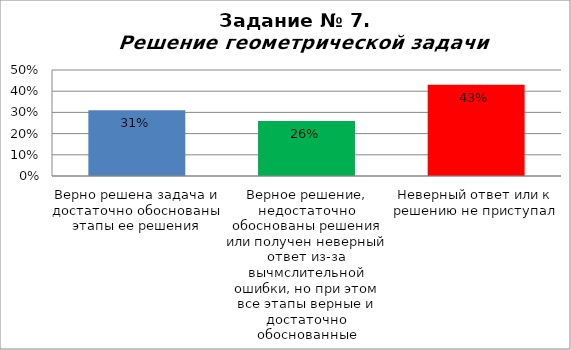
| Category | Решение геометрической задачи  |
|---|---|
| Верно решена задача и достаточно обоснованы этапы ее решения | 0.31 |
| Верное решение, недостаточно обоснованы решения или получен неверный ответ из-за вычмслительной ошибки, но при этом все этапы верные и достаточно обоснованные | 0.26 |
| Неверный ответ или к решению не приступал | 0.43 |